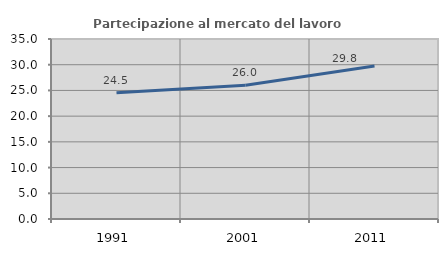
| Category | Partecipazione al mercato del lavoro  femminile |
|---|---|
| 1991.0 | 24.533 |
| 2001.0 | 26.011 |
| 2011.0 | 29.756 |